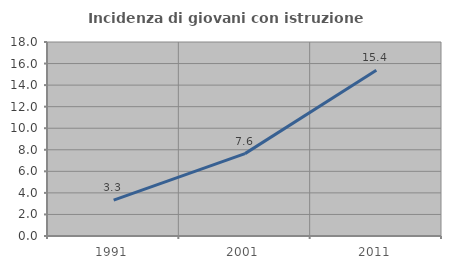
| Category | Incidenza di giovani con istruzione universitaria |
|---|---|
| 1991.0 | 3.327 |
| 2001.0 | 7.642 |
| 2011.0 | 15.373 |